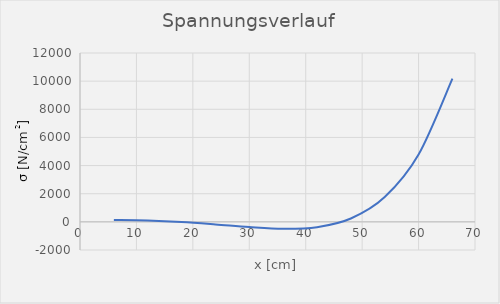
| Category | Series 0 |
|---|---|
| 6.0 | 136.872 |
| 12.0 | 96.301 |
| 18.0 | -10.286 |
| 24.0 | -179.964 |
| 30.0 | -371.974 |
| 36.0 | -493.209 |
| 42.0 | -378.263 |
| 48.0 | 238.182 |
| 54.0 | 1759.9 |
| 60.0 | 4783.417 |
| 66.0 | 10175.304 |